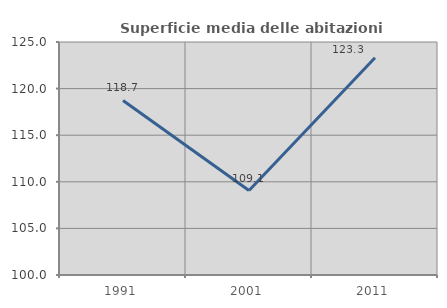
| Category | Superficie media delle abitazioni occupate |
|---|---|
| 1991.0 | 118.732 |
| 2001.0 | 109.062 |
| 2011.0 | 123.318 |